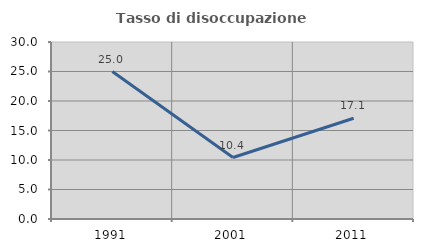
| Category | Tasso di disoccupazione giovanile  |
|---|---|
| 1991.0 | 25 |
| 2001.0 | 10.417 |
| 2011.0 | 17.073 |